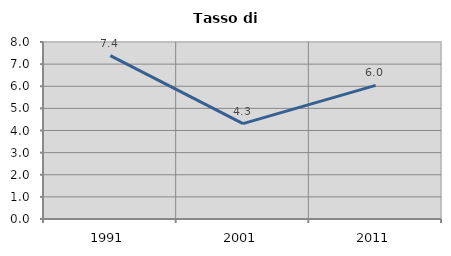
| Category | Tasso di disoccupazione   |
|---|---|
| 1991.0 | 7.388 |
| 2001.0 | 4.311 |
| 2011.0 | 6.037 |